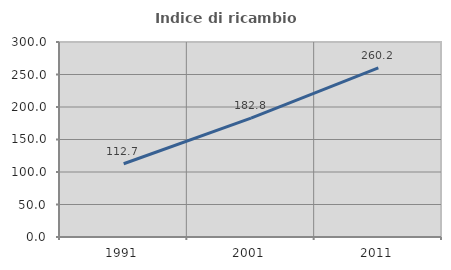
| Category | Indice di ricambio occupazionale  |
|---|---|
| 1991.0 | 112.651 |
| 2001.0 | 182.787 |
| 2011.0 | 260.227 |